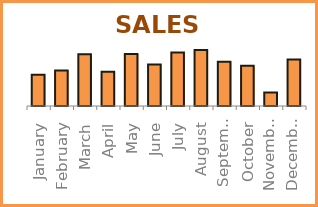
| Category | SALES |
|---|---|
| January | 5310984 |
| February | 6021030 |
| March | 8758033 |
| April | 5791462 |
| May | 8826333 |
| June | 7050210 |
| July | 9064330 |
| August | 9482147 |
| September | 7515253 |
| October | 6811511 |
| November | 2269551 |
| December | 7874398 |